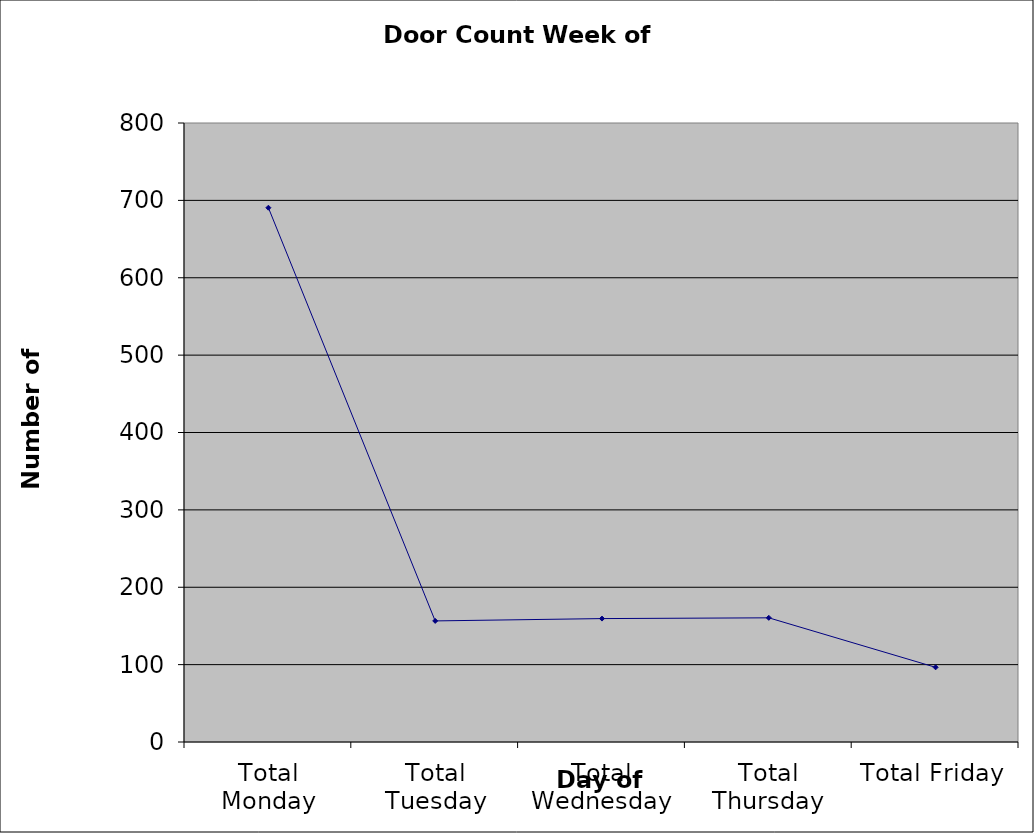
| Category | Series 0 |
|---|---|
| Total Monday | 690.5 |
| Total Tuesday | 156.5 |
| Total Wednesday | 159.5 |
| Total Thursday | 160.5 |
| Total Friday | 96.5 |